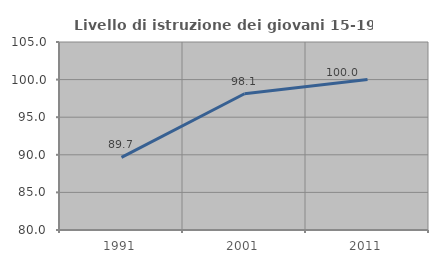
| Category | Livello di istruzione dei giovani 15-19 anni |
|---|---|
| 1991.0 | 89.655 |
| 2001.0 | 98.113 |
| 2011.0 | 100 |